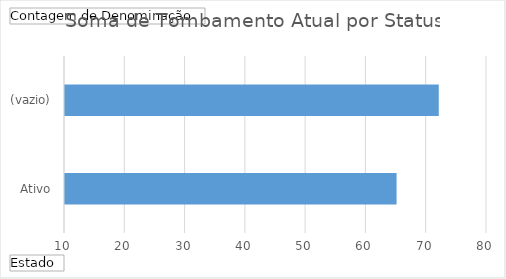
| Category | Total |
|---|---|
| Ativo | 65 |
| (vazio) | 72 |